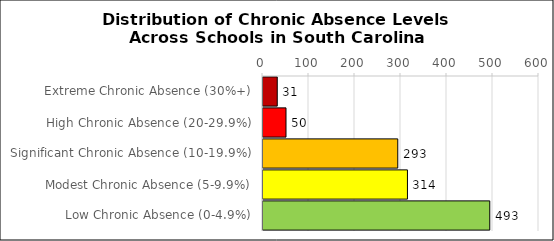
| Category | Number of Schools |
|---|---|
| Extreme Chronic Absence (30%+) | 31 |
| High Chronic Absence (20-29.9%) | 50 |
| Significant Chronic Absence (10-19.9%) | 293 |
| Modest Chronic Absence (5-9.9%) | 314 |
| Low Chronic Absence (0-4.9%) | 493 |